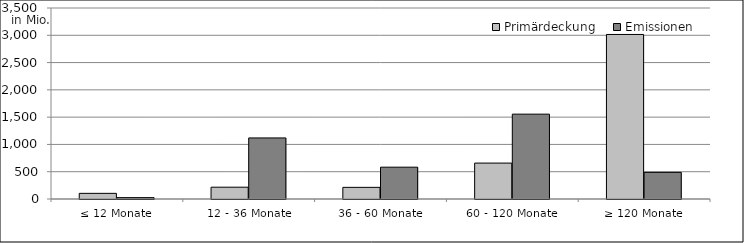
| Category | Primärdeckung | Emissionen |
|---|---|---|
| ≤ 12 Monate | 103464132.7 | 25000000 |
| 12 - 36 Monate | 216257170.392 | 1119006666.46 |
| 36 - 60 Monate | 213322265.499 | 583150000 |
| 60 - 120 Monate | 658128436.748 | 1555000000 |
| ≥ 120 Monate | 3015169778.242 | 488144003.11 |